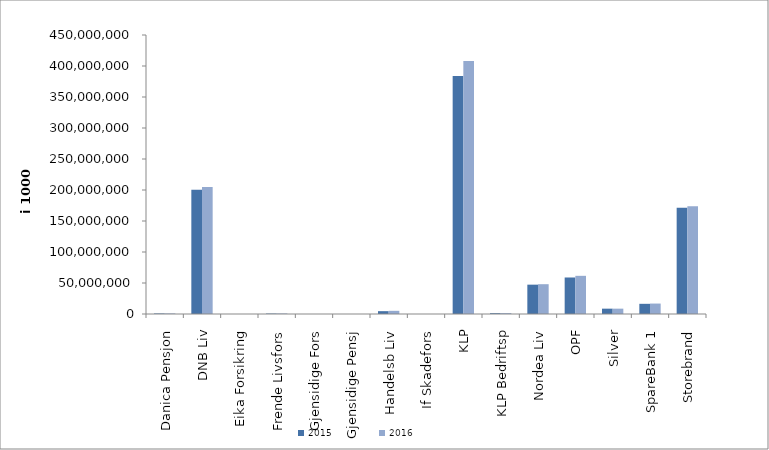
| Category | 2015 | 2016 |
|---|---|---|
| 0 | 871760.159 | 910116.415 |
| 1 | 200578226 | 204999593 |
| 2 | 0 | 0 |
| 3 | 712840 | 832830 |
| 4 | 0 | 0 |
| 5 | 0 | 0 |
| 6 | 4584145.583 | 5116874.043 |
| 7 | 0 | 0 |
| 8 | 383972113.197 | 408022300.043 |
| 9 | 1331683 | 1444299 |
| 10 | 47330176.09 | 48064765.021 |
| 11 | 58892941 | 61571650 |
| 12 | 8603713.236 | 8612877.074 |
| 13 | 16425734.104 | 16839593.388 |
| 14 | 171234150.406 | 173966226.97 |